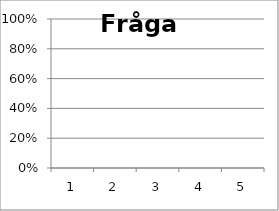
| Category | Fråga 2 |
|---|---|
| 0 | 0 |
| 1 | 0 |
| 2 | 0 |
| 3 | 0 |
| 4 | 0 |